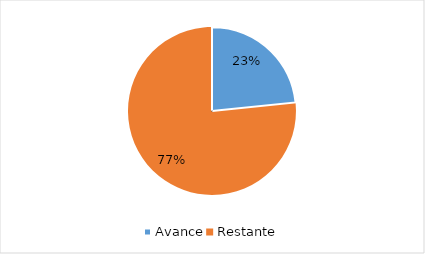
| Category | Series 0 |
|---|---|
| Avance | 0.234 |
| Restante | 0.766 |